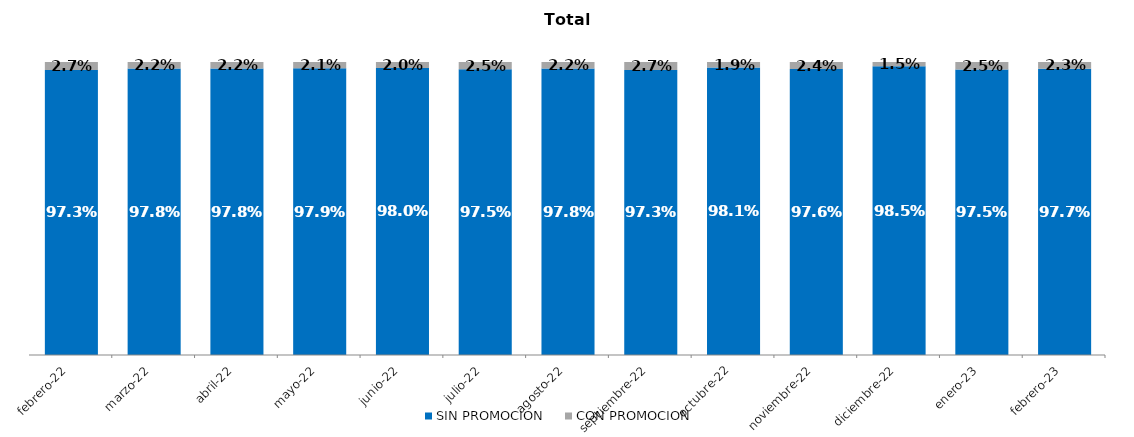
| Category | SIN PROMOCION   | CON PROMOCION   |
|---|---|---|
| 2022-02-01 | 0.973 | 0.027 |
| 2022-03-01 | 0.978 | 0.022 |
| 2022-04-01 | 0.978 | 0.022 |
| 2022-05-01 | 0.979 | 0.021 |
| 2022-06-01 | 0.98 | 0.02 |
| 2022-07-01 | 0.975 | 0.025 |
| 2022-08-01 | 0.978 | 0.022 |
| 2022-09-01 | 0.973 | 0.027 |
| 2022-10-01 | 0.981 | 0.019 |
| 2022-11-01 | 0.976 | 0.024 |
| 2022-12-01 | 0.985 | 0.015 |
| 2023-01-01 | 0.975 | 0.025 |
| 2023-02-01 | 0.977 | 0.023 |